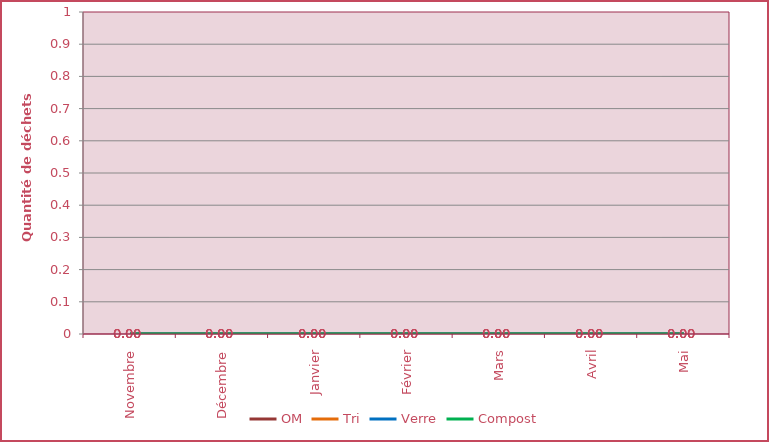
| Category | OM | Tri | Verre | Compost |
|---|---|---|---|---|
| Novembre | 0 | 0 | 0 | 0 |
| Décembre | 0 | 0 | 0 | 0 |
| Janvier | 0 | 0 | 0 | 0 |
| Février | 0 | 0 | 0 | 0 |
| Mars | 0 | 0 | 0 | 0 |
| Avril | 0 | 0 | 0 | 0 |
| Mai | 0 | 0 | 0 | 0 |